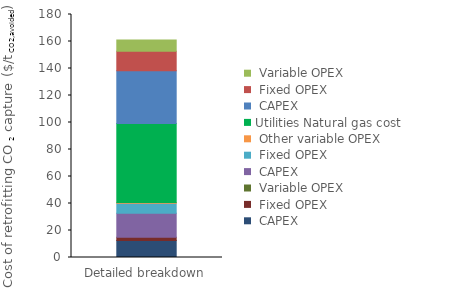
| Category | Interconnecting | Utilities | Series 0 | Series 1 | Series 2 |
|---|---|---|---|---|---|
| 0 | 0 | 58.631 | 38.959 | 14.567 | 8.335 |